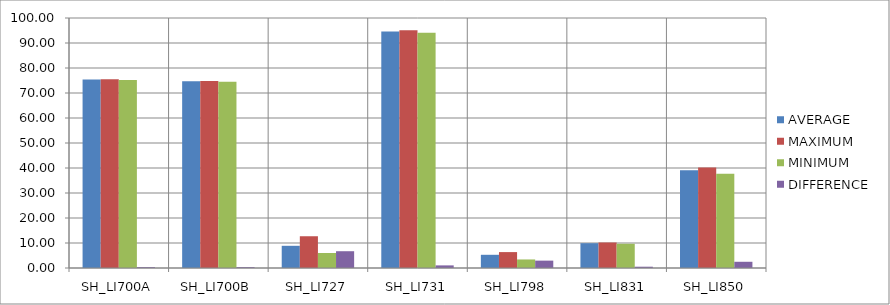
| Category | AVERAGE | MAXIMUM | MINIMUM | DIFFERENCE |
|---|---|---|---|---|
| SH_LI700A | 75.379 | 75.499 | 75.155 | 0.344 |
| SH_LI700B | 74.701 | 74.821 | 74.477 | 0.344 |
| SH_LI727 | 8.878 | 12.703 | 5.99 | 6.713 |
| SH_LI731 | 94.627 | 95.104 | 94.062 | 1.042 |
| SH_LI798 | 5.28 | 6.363 | 3.416 | 2.947 |
| SH_LI831 | 9.923 | 10.204 | 9.689 | 0.516 |
| SH_LI850 | 39.051 | 40.234 | 37.746 | 2.488 |